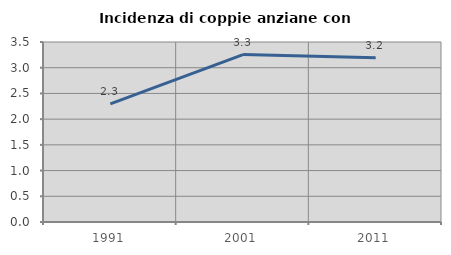
| Category | Incidenza di coppie anziane con figli |
|---|---|
| 1991.0 | 2.296 |
| 2001.0 | 3.256 |
| 2011.0 | 3.191 |